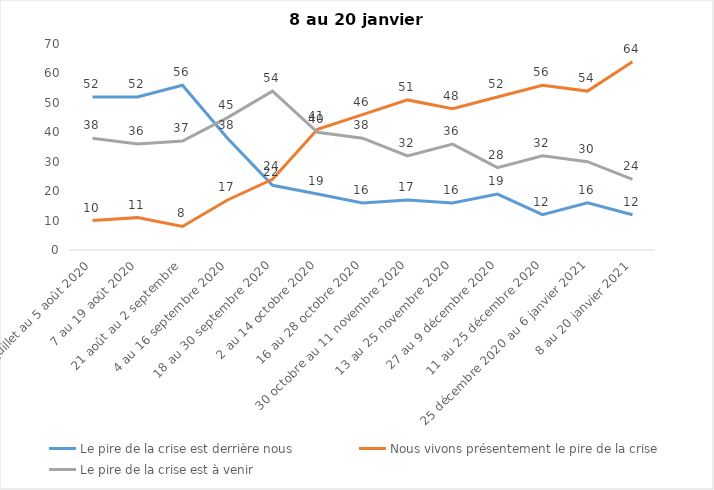
| Category | Le pire de la crise est derrière nous | Nous vivons présentement le pire de la crise | Le pire de la crise est à venir |
|---|---|---|---|
| 24 juillet au 5 août 2020 | 52 | 10 | 38 |
| 7 au 19 août 2020 | 52 | 11 | 36 |
| 21 août au 2 septembre | 56 | 8 | 37 |
| 4 au 16 septembre 2020 | 38 | 17 | 45 |
| 18 au 30 septembre 2020 | 22 | 24 | 54 |
| 2 au 14 octobre 2020 | 19 | 41 | 40 |
| 16 au 28 octobre 2020 | 16 | 46 | 38 |
| 30 octobre au 11 novembre 2020 | 17 | 51 | 32 |
| 13 au 25 novembre 2020 | 16 | 48 | 36 |
| 27 au 9 décembre 2020 | 19 | 52 | 28 |
| 11 au 25 décembre 2020 | 12 | 56 | 32 |
| 25 décembre 2020 au 6 janvier 2021 | 16 | 54 | 30 |
| 8 au 20 janvier 2021 | 12 | 64 | 24 |